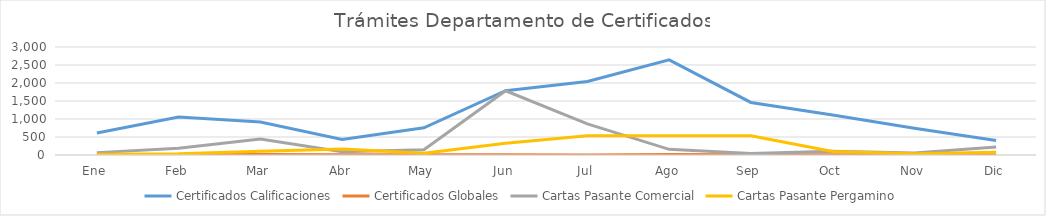
| Category | Certificados Calificaciones | Certificados Globales | Cartas Pasante Comercial | Cartas Pasante Pergamino |
|---|---|---|---|---|
| Ene | 609 | 16 | 66 | 22 |
| Feb | 1056 | 10 | 190 | 34 |
| Mar | 916 | 15 | 447 | 107 |
| Abr | 432 | 7 | 89 | 167 |
| May | 757 | 8 | 148 | 46 |
| Jun | 1787 | 7 | 1784 | 327 |
| Jul | 2042 | 3 | 864 | 533 |
| Ago | 2642 | 15 | 158 | 534 |
| Sep | 1460 | 6 | 43 | 535 |
| Oct | 1111 | 5 | 105 | 95 |
| Nov | 745 | 8 | 57 | 35 |
| Dic | 400 | 2 | 219 | 79 |